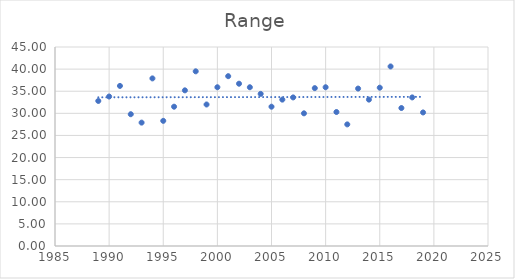
| Category | Range |
|---|---|
| 1989.0 | 32.8 |
| 1990.0 | 33.8 |
| 1991.0 | 36.2 |
| 1992.0 | 29.8 |
| 1993.0 | 27.9 |
| 1994.0 | 37.9 |
| 1995.0 | 28.3 |
| 1996.0 | 31.5 |
| 1997.0 | 35.2 |
| 1998.0 | 39.5 |
| 1999.0 | 32 |
| 2000.0 | 35.9 |
| 2001.0 | 38.4 |
| 2002.0 | 36.7 |
| 2003.0 | 35.9 |
| 2004.0 | 34.4 |
| 2005.0 | 31.5 |
| 2006.0 | 33.1 |
| 2007.0 | 33.6 |
| 2008.0 | 30 |
| 2009.0 | 35.7 |
| 2010.0 | 35.9 |
| 2011.0 | 30.3 |
| 2012.0 | 27.5 |
| 2013.0 | 35.6 |
| 2014.0 | 33.1 |
| 2015.0 | 35.8 |
| 2016.0 | 40.6 |
| 2017.0 | 31.2 |
| 2018.0 | 33.6 |
| 2019.0 | 30.2 |